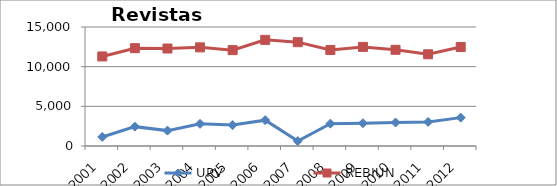
| Category | UPV | REBIUN |
|---|---|---|
| 2001 | 1140 | 11288.229 |
| 2002 | 2439 | 12330.979 |
| 2003 | 1940 | 12286.458 |
| 2004 | 2794 | 12432.531 |
| 2005 | 2634 | 12081.857 |
| 2006 | 3258 | 13380.061 |
| 2007 | 624 | 13089.531 |
| 2008 | 2819 | 12095.694 |
| 2009 | 2870 | 12489.327 |
| 2010 | 2960 | 12128.08 |
| 2011 | 3040 | 11562 |
| 2012 | 3576 | 12479 |